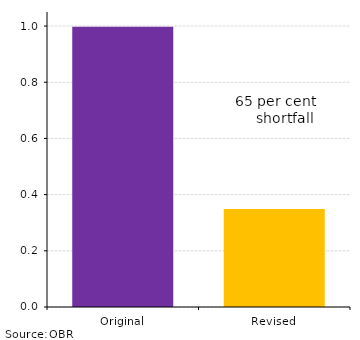
| Category | Series 0 |
|---|---|
| Original | 997.143 |
| Revised | 348.571 |